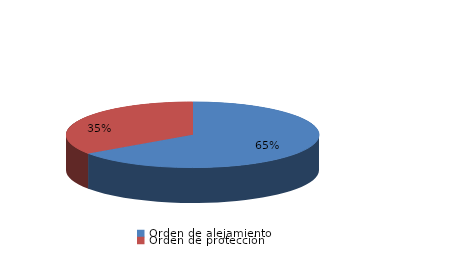
| Category | Series 0 |
|---|---|
| Orden de alejamiento | 17 |
| Orden de protección | 9 |